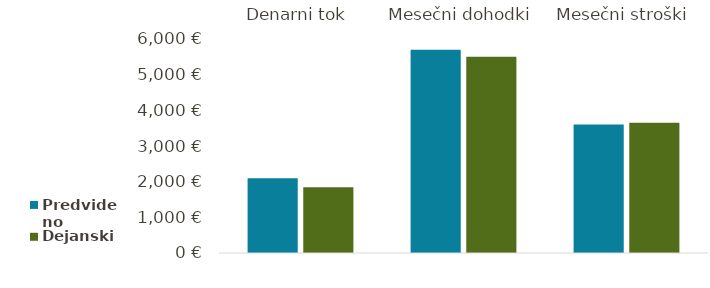
| Category | Predvideno | Dejanski |
|---|---|---|
| Denarni tok | 2097 | 1845 |
| Mesečni dohodki | 5700 | 5500 |
| Mesečni stroški | 3603 | 3655 |